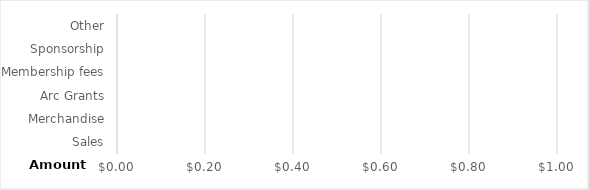
| Category | Amount |
|---|---|
| Sales | 0 |
| Merchandise | 0 |
| Arc Grants | 0 |
| Membership fees | 0 |
| Sponsorship | 0 |
| Other | 0 |